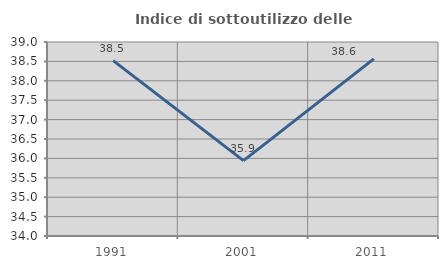
| Category | Indice di sottoutilizzo delle abitazioni  |
|---|---|
| 1991.0 | 38.521 |
| 2001.0 | 35.941 |
| 2011.0 | 38.565 |